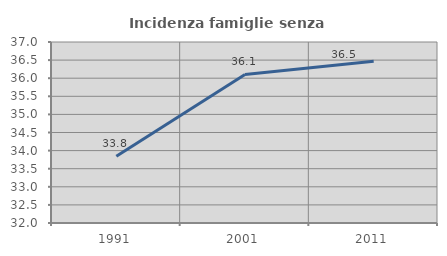
| Category | Incidenza famiglie senza nuclei |
|---|---|
| 1991.0 | 33.843 |
| 2001.0 | 36.105 |
| 2011.0 | 36.465 |